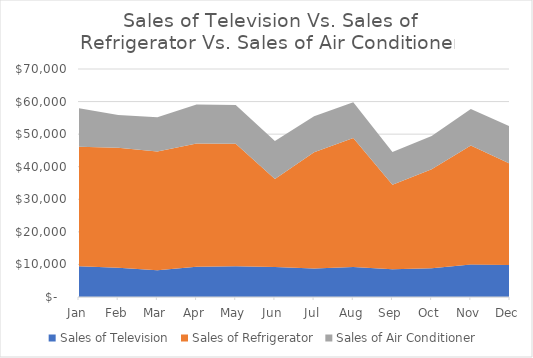
| Category | Sales of Television | Sales of Refrigerator | Sales of Air Conditioner |
|---|---|---|---|
| Jan | 9420 | 36700 | 11800 |
| Feb | 9000 | 36850 | 10050 |
| Mar | 8250 | 36450 | 10500 |
| Apr | 9250 | 37900 | 11950 |
| May | 9470 | 37550 | 11900 |
| Jun | 9200 | 27000 | 11700 |
| Jul | 8750 | 35700 | 11050 |
| Aug | 9200 | 39650 | 10950 |
| Sep | 8500 | 26000 | 10050 |
| Oct | 8850 | 30400 | 10200 |
| Nov | 9950 | 36550 | 11200 |
| Dec | 9850 | 31050 | 11500 |